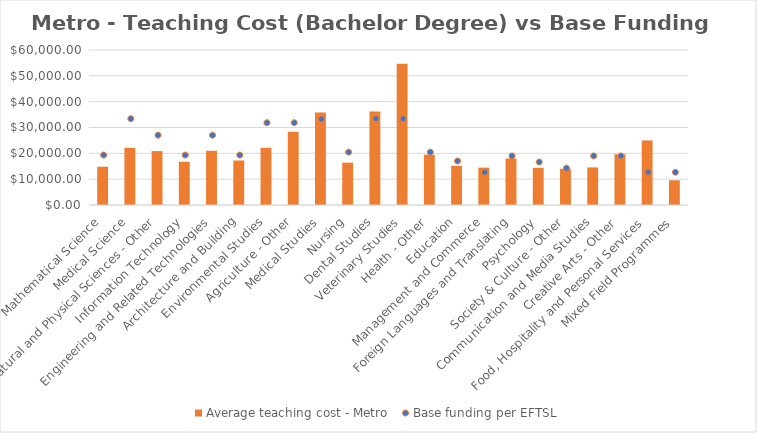
| Category | Average teaching cost - Metro  |
|---|---|
| Mathematical Science | 14805.848 |
| Medical Science | 22129.991 |
| Natural and Physical Sciences - Other | 20859.764 |
| Information Technology | 16742.303 |
| Engineering and Related Technologies | 20993.387 |
| Architecture and Building | 17229.544 |
| Environmental Studies | 22155.26 |
| Agriculture - Other | 28352.837 |
| Medical Studies | 35827.465 |
| Nursing | 16375.87 |
| Dental Studies | 36186.867 |
| Veterinary Studies | 54630.85 |
| Health - Other | 19464.682 |
| Education | 15152.128 |
| Management and Commerce | 14454.41 |
| Foreign Languages and Translating | 17992.268 |
| Psychology | 14394.767 |
| Society & Culture - Other | 14016.077 |
| Communication and Media Studies | 14541.755 |
| Creative Arts - Other | 19649.995 |
| Food, Hospitality and Personal Services | 24988.802 |
| Mixed Field Programmes | 9574.386 |